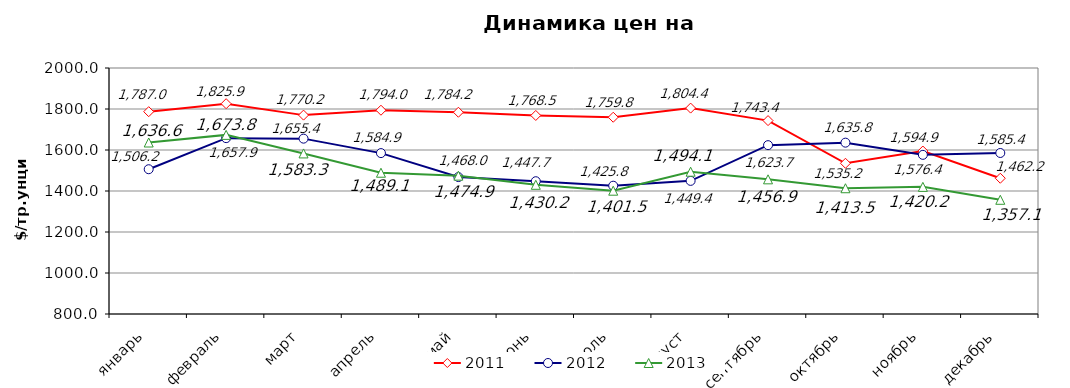
| Category | 2011 | 2012 | 2013 |
|---|---|---|---|
| январь | 1786.95 | 1506.24 | 1636.57 |
| февраль | 1825.9 | 1657.86 | 1673.75 |
| март | 1770.17 | 1655.41 | 1583.3 |
| апрель | 1794 | 1584.89 | 1489.12 |
| май | 1784.15 | 1468 | 1474.9 |
| июнь | 1768.5 | 1447.74 | 1430.23 |
| июль | 1759.76 | 1425.8 | 1401.48 |
| август | 1804.36 | 1449.4 | 1494.1 |
| сентябрь | 1743.44 | 1623.7 | 1456.86 |
| октябрь | 1535.19 | 1635.83 | 1413.48 |
| ноябрь | 1594.93 | 1576.36 | 1420.19 |
| декабрь | 1462.2 | 1585.42 | 1357.1 |